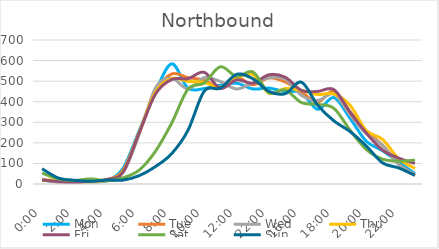
| Category | Mon | Tue | Wed | Thu | Fri | Sat | Sun |
|---|---|---|---|---|---|---|---|
| 0.0 | 19 | 20 | 24 | 20 | 20 | 53 | 74 |
| 0.041667 | 10 | 10 | 8 | 18 | 12 | 25 | 29 |
| 0.083333 | 7 | 8 | 10 | 9 | 6 | 17 | 18 |
| 0.125 | 11 | 15 | 8 | 11 | 15 | 25 | 13 |
| 0.166667 | 17 | 21 | 17 | 21 | 22 | 15 | 19 |
| 0.208333 | 77 | 67 | 56 | 63 | 59 | 30 | 19 |
| 0.25 | 261 | 250 | 244 | 254 | 251 | 68 | 41 |
| 0.291667 | 449 | 450 | 467 | 448 | 438 | 160 | 85 |
| 0.333333 | 584 | 535 | 514 | 513 | 508 | 297 | 148 |
| 0.375 | 466 | 517 | 462 | 499 | 512 | 461 | 261 |
| 0.416667 | 464 | 505 | 517 | 494 | 543 | 491 | 451 |
| 0.458333 | 480 | 468 | 498 | 470 | 465 | 570 | 466 |
| 0.5 | 490 | 518 | 462 | 516 | 506 | 523 | 533 |
| 0.541667 | 462 | 482 | 491 | 532 | 490 | 545 | 512 |
| 1900-01-02 22:00:00 | 466 | 516 | 516 | 441 | 531 | 444 | 450 |
| 0.625 | 449 | 496 | 510 | 464 | 519 | 457 | 439 |
| 0.666667 | 444 | 448 | 431 | 455 | 455 | 396 | 495 |
| 0.708333 | 363 | 398 | 406 | 435 | 450 | 387 | 383 |
| 0.75 | 420 | 452 | 437 | 438 | 459 | 368 | 307 |
| 0.791667 | 319 | 351 | 336 | 383 | 349 | 262 | 255 |
| 0.833333 | 208 | 257 | 244 | 260 | 248 | 168 | 185 |
| 0.875 | 162 | 189 | 188 | 217 | 165 | 121 | 103 |
| 0.916667 | 106 | 97 | 95 | 123 | 126 | 111 | 78 |
| 0.958333 | 51 | 42 | 47 | 76 | 100 | 116 | 42 |